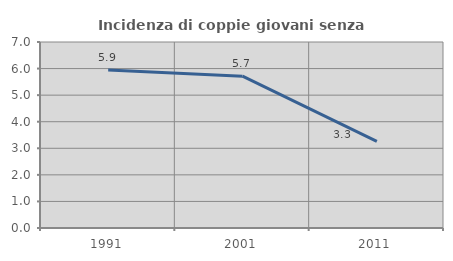
| Category | Incidenza di coppie giovani senza figli |
|---|---|
| 1991.0 | 5.947 |
| 2001.0 | 5.714 |
| 2011.0 | 3.259 |